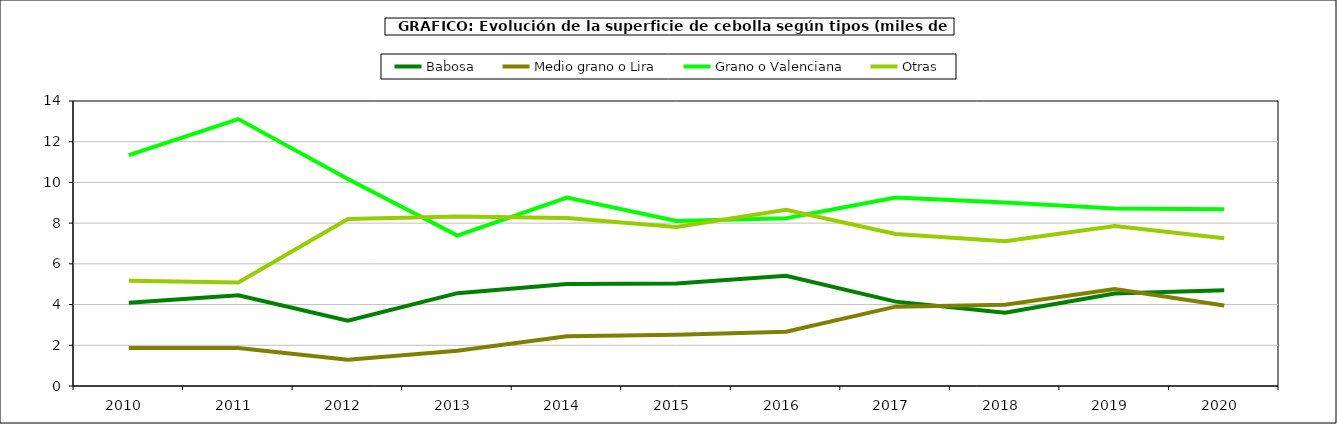
| Category | Babosa | Medio grano o Lira | Grano o Valenciana | Otras |
|---|---|---|---|---|
| 2010.0 | 4.091 | 1.869 | 11.342 | 5.176 |
| 2011.0 | 4.456 | 1.87 | 13.112 | 5.088 |
| 2012.0 | 3.212 | 1.284 | 10.171 | 8.2 |
| 2013.0 | 4.561 | 1.735 | 7.391 | 8.321 |
| 2014.0 | 5.014 | 2.441 | 9.254 | 8.252 |
| 2015.0 | 5.04 | 2.521 | 8.109 | 7.81 |
| 2016.0 | 5.414 | 2.662 | 8.238 | 8.655 |
| 2017.0 | 4.145 | 3.897 | 9.256 | 7.464 |
| 2018.0 | 3.6 | 3.987 | 9.012 | 7.113 |
| 2019.0 | 4.546 | 4.766 | 8.714 | 7.863 |
| 2020.0 | 4.709 | 3.952 | 8.688 | 7.259 |